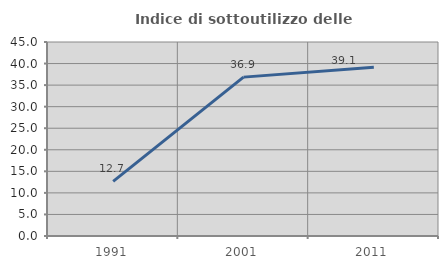
| Category | Indice di sottoutilizzo delle abitazioni  |
|---|---|
| 1991.0 | 12.682 |
| 2001.0 | 36.852 |
| 2011.0 | 39.138 |